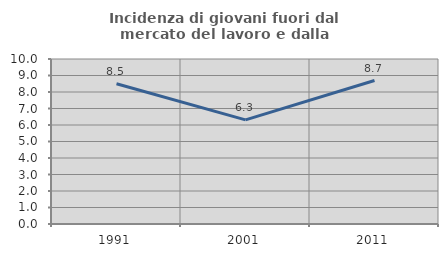
| Category | Incidenza di giovani fuori dal mercato del lavoro e dalla formazione  |
|---|---|
| 1991.0 | 8.502 |
| 2001.0 | 6.312 |
| 2011.0 | 8.696 |